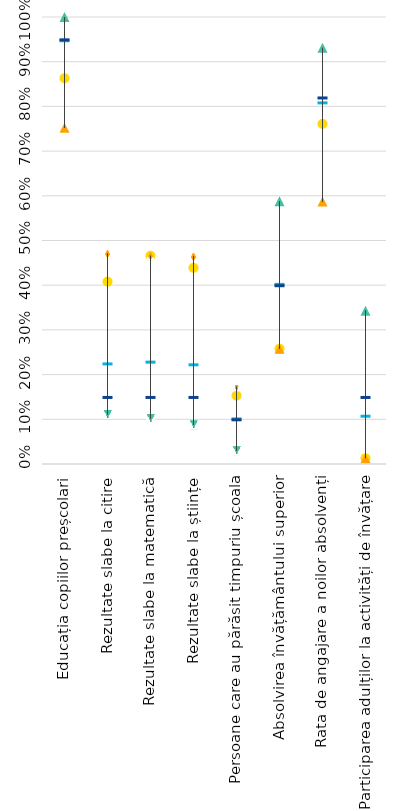
| Category | Romania | Strongest performer | Weakest performer | EU average | EU target |
|---|---|---|---|---|---|
| Educația copiilor preșcolari | 0.863 | 1 | 0.752 | 0.948 | 0.95 |
| Rezultate slabe la citire | 0.408 | 0.111 | 0.471 | 0.225 | 0.15 |
| Rezultate slabe la matematică | 0.466 | 0.102 | 0.466 | 0.229 | 0.15 |
| Rezultate slabe la științe | 0.439 | 0.088 | 0.465 | 0.223 | 0.15 |
| Persoane care au părăsit timpuriu școala | 0.153 | 0.03 | 0.173 | 0.102 | 0.1 |
| Absolvirea învățământului superior | 0.258 | 0.588 | 0.258 | 0.403 | 0.4 |
| Rata de angajare a noilor absolvenți | 0.761 | 0.931 | 0.587 | 0.809 | 0.82 |
| Participarea adulților la activități de învățare | 0.013 | 0.343 | 0.013 | 0.108 | 0.15 |